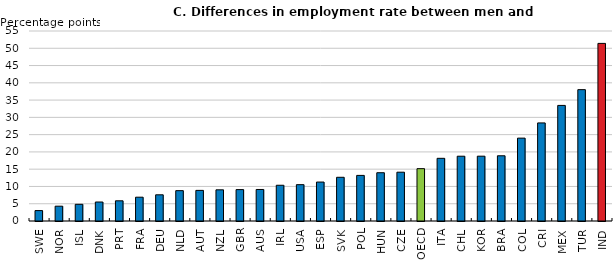
| Category | Employment rate for men - employment rate for women |
|---|---|
| SWE | 3.015 |
| NOR | 4.292 |
| ISL | 4.833 |
| DNK | 5.5 |
| PRT | 5.847 |
| FRA | 6.889 |
| DEU | 7.583 |
| NLD | 8.787 |
| AUT | 8.864 |
| NZL | 9.026 |
| GBR | 9.09 |
| AUS | 9.127 |
| IRL | 10.346 |
| USA | 10.517 |
| ESP | 11.274 |
| SVK | 12.655 |
| POL | 13.201 |
| HUN | 13.975 |
| CZE | 14.128 |
| OECD | 15.15 |
| ITA | 18.145 |
| CHL | 18.753 |
| KOR | 18.764 |
| BRA | 18.88 |
| COL | 23.987 |
| CRI | 28.394 |
| MEX | 33.46 |
| TUR | 38.021 |
| IND | 51.409 |